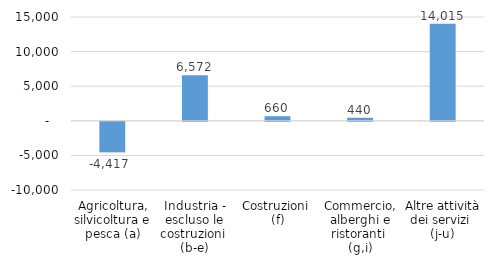
| Category | Series 0 |
|---|---|
| Agricoltura, silvicoltura e pesca (a) | -4417 |
| Industria - escluso le costruzioni 
(b-e) | 6572 |
| Costruzioni 
(f) | 660 |
| Commercio, alberghi e ristoranti 
(g,i) | 440 |
| Altre attività dei servizi 
(j-u) | 14015 |